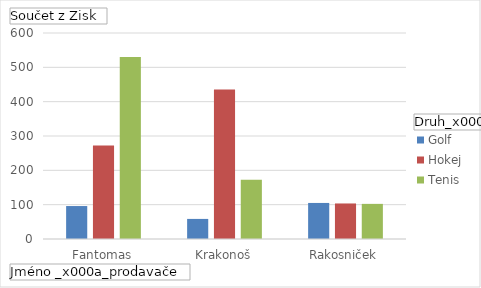
| Category | Golf | Hokej | Tenis |
|---|---|---|---|
| Fantomas | 96 | 272 | 530.4 |
| Krakonoš | 58.5 | 435.2 | 172.8 |
| Rakosniček | 105 | 103.5 | 102.3 |